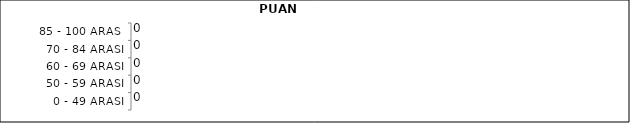
| Category | Series 0 | Series 1 | Series 2 |
|---|---|---|---|
| 0 - 49 ARASI |  |  | 0 |
| 50 - 59 ARASI |  |  | 0 |
| 60 - 69 ARASI |  |  | 0 |
| 70 - 84 ARASI |  |  | 0 |
| 85 - 100 ARASI |  |  | 0 |